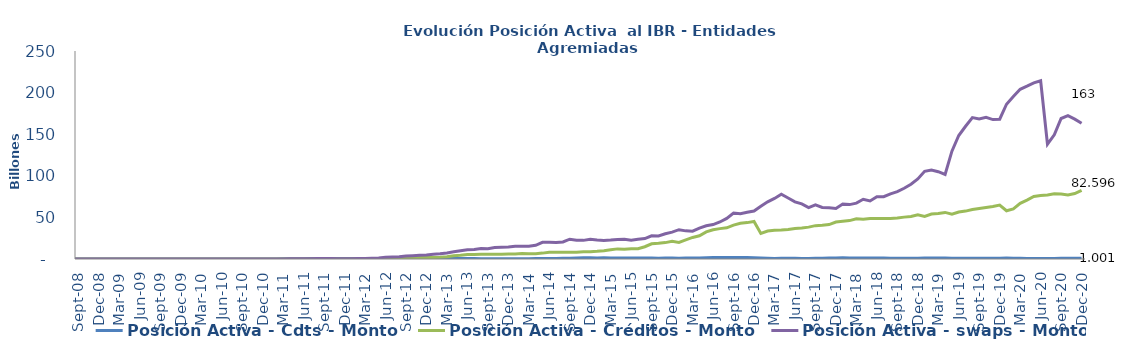
| Category | Posición Activa - Cdts - Monto | Posición Activa - Créditos - Monto | Posición Activa - swaps - Monto |
|---|---|---|---|
| 2008-07-01 | 0 | 0 | 0 |
| 2008-08-01 | 0 | 0 | 0 |
| 2008-09-01 | 0 | 0 | 0 |
| 2008-10-01 | 0 | 0 | 0 |
| 2008-11-01 | 0 | 0 | 0 |
| 2008-12-01 | 0 | 0 | 0 |
| 2009-01-01 | 0 | 0 | 0 |
| 2009-02-01 | 7428500000 | 0 | 0 |
| 2009-03-01 | 7428500000 | 0 | 0 |
| 2009-04-01 | 7428500000 | 0 | 0 |
| 2009-05-01 | 7428500000 | 0 | 0 |
| 2009-06-01 | 7428500000 | 0 | 0 |
| 2009-07-01 | 7428500000 | 0 | 0 |
| 2009-08-01 | 7428500000 | 0 | 0 |
| 2009-09-01 | 7428500000 | 0 | 0 |
| 2009-10-01 | 7928500000 | 0 | 0 |
| 2009-11-01 | 22928500000 | 0 | 0 |
| 2009-12-01 | 22928500000 | 0 | 0 |
| 2010-01-01 | 22928500000 | 0 | 400000000 |
| 2010-02-01 | 22928500000 | 0 | 400000000 |
| 2010-03-01 | 22928500000 | 0 | 1300000000 |
| 2010-04-01 | 22928500000 | 0 | 9300000000 |
| 2010-05-01 | 22928500000 | 0 | 24000000000 |
| 2010-06-01 | 22928500000 | 0 | 35000000000 |
| 2010-07-01 | 22928500000 | 0 | 49000000000 |
| 2010-08-01 | 15500000000 | 0 | 51000000000 |
| 2010-09-01 | 15500000000 | 0 | 42000000000 |
| 2010-10-01 | 62500000000 | 0 | 41000000000 |
| 2010-11-01 | 79500000000 | 0 | 29000000000 |
| 2010-12-01 | 81500000000 | 0 | 22000000000 |
| 2011-01-01 | 86000000000 | 0 | 23500000000 |
| 2011-02-01 | 134000000000 | 0 | 79500000000 |
| 2011-03-01 | 251400000000 | 0 | 114500000000 |
| 2011-04-01 | 282400000000 | 0 | 212500000000 |
| 2011-05-01 | 311900000000 | 0 | 246500000000 |
| 2011-06-01 | 450924000000 | 0 | 280500000000 |
| 2011-07-01 | 628924000000 | 0 | 307500000000 |
| 2011-08-01 | 650424000000 | 0 | 496500000000 |
| 2011-09-01 | 590324000000 | 0 | 493500000000 |
| 2011-10-01 | 571324000000 | 0 | 503000000000 |
| 2011-11-01 | 564354000000 | 0 | 357000000000 |
| 2011-12-01 | 573354000000 | 0 | 348000000000 |
| 2012-01-01 | 578854000000 | 0 | 368000000000 |
| 2012-02-01 | 569324000000 | 0 | 469000000000 |
| 2012-03-01 | 394324000000 | 0 | 708000000000 |
| 2012-04-01 | 362824000000 | 0 | 1052500000000 |
| 2012-05-01 | 425324000000 | 0 | 1321850000000 |
| 2012-06-01 | 472528000000 | 0 | 2131450000000 |
| 2012-07-01 | 467028000000 | 10736400932.6 | 2430450000000 |
| 2012-08-01 | 467028000000 | 395898409383.73 | 2831550000000 |
| 2012-09-01 | 514128000000 | 1278623915608.46 | 3465550000000 |
| 2012-10-01 | 528328000000 | 1409219995143.76 | 3916900000000 |
| 2012-11-01 | 503328000000 | 1739292606539.45 | 4543100000000 |
| 2012-12-01 | 538118000000 | 1753702085065.83 | 4921600000000 |
| 2013-01-01 | 612118000000 | 1860190799905.28 | 5800050000000 |
| 2013-02-01 | 567619540000 | 2113733072125.38 | 6318174692981 |
| 2013-03-01 | 626411310533 | 2638808537970.97 | 7322374692981 |
| 2013-04-01 | 629111310533 | 3794306574436.62 | 8687553692981 |
| 2013-05-01 | 639011310533 | 4443519152060.31 | 9853614804093 |
| 2013-06-01 | 579211310533 | 5441636414484 | 11004589051114 |
| 2013-07-01 | 619911310533 | 5276885903223 | 11472101064827 |
| 2013-08-01 | 264748310533 | 5793112373612 | 12500291064827 |
| 2013-09-01 | 235198310533 | 5781182186427 | 12379491064827 |
| 2013-10-01 | 287324065335 | 5721227676911.381 | 13896537064827 |
| 2013-11-01 | 330716307053.16 | 5769151414412.79 | 14219298533045 |
| 2013-12-01 | 351289281441 | 6033441138708.75 | 14497299602830 |
| 2014-01-01 | 415560557858 | 5904465606780.36 | 15189393602830 |
| 2014-02-01 | 421812163336 | 6592170750743.01 | 15247970102830 |
| 2014-03-01 | 398635445434 | 6454762439295.27 | 15371390390463 |
| 2014-04-01 | 505726541829 | 6413323429971.03 | 16452051310463 |
| 2014-05-01 | 522799425000 | 7069454807140.37 | 19992594629221.91 |
| 2014-06-01 | 617169430000 | 8104068718395.04 | 20048124203761.16 |
| 2014-07-01 | 680622729450 | 8165185122690.54 | 19722335424382.492 |
| 2014-08-01 | 756139827000 | 8078177412953.88 | 20517588213883 |
| 2014-09-01 | 938513426809.328 | 8003623952520.778 | 23817248811402.992 |
| 2014-10-01 | 1085627969999.998 | 8010472710623.305 | 22656264562178.992 |
| 2014-11-01 | 1356560691367.905 | 8724921587924.001 | 22396570950523 |
| 2014-12-01 | 1367078350000 | 8797305493724.32 | 23642742101498 |
| 2015-01-01 | 1293754500000 | 9263385595110.854 | 22764940027082.715 |
| 2015-02-01 | 1390322000000 | 10008403554124.396 | 22210507490027 |
| 2015-03-01 | 1291122000000 | 11056737501660.055 | 22789161192534.68 |
| 2015-04-01 | 1155322000000 | 12157445776599.592 | 23567227758727.7 |
| 2015-05-01 | 1089813000000 | 11714375535106.436 | 23774907278634.305 |
| 2015-06-01 | 1141513000000 | 12407392413540.484 | 22696018508157.156 |
| 2015-07-01 | 1269327666147 | 12421253163765.184 | 23667535655155.49 |
| 2015-08-01 | 1149827666147 | 14732094647912.19 | 24499865405155.484 |
| 2015-09-01 | 1094927666147 | 18275955310324.863 | 27906116302241.14 |
| 2015-10-01 | 986527666147 | 18878869867150.16 | 27759640112993.98 |
| 2015-11-01 | 1087027666147 | 19694520524655.047 | 30367137758015.98 |
| 2015-12-01 | 1081027666147 | 21192540679005.13 | 32342306254816.98 |
| 2016-01-01 | 1038064375438.43 | 19977514817492.54 | 35212979556095.375 |
| 2016-02-01 | 1068049372938.43 | 22902299660100.133 | 33822025975882.445 |
| 2016-03-01 | 1257396510438.43 | 25918368881639.652 | 33434779272390.047 |
| 2016-04-01 | 1145425000000 | 27903668641981.312 | 37046880484154.11 |
| 2016-05-01 | 1531395000000 | 32621114880164.73 | 39908396979761.27 |
| 2016-06-01 | 1705195000000 | 35183640497890.742 | 41366680595973.1 |
| 2016-07-01 | 1836308000000 | 36521841812503.32 | 44471316930976.79 |
| 2016-08-01 | 1870808000000 | 37465674066332.95 | 48816567034654.92 |
| 2016-09-01 | 1929687493130 | 40686213476757.7 | 55251579491117.45 |
| 2016-10-01 | 1882682961712 | 42864686598625.914 | 54309484290905.336 |
| 2016-11-01 | 1878248867176 | 43733971005961.09 | 56118948154012.44 |
| 2016-12-01 | 1468748425000 | 45151117036611.55 | 57699253311873.81 |
| 2017-01-01 | 1143108000000 | 30719580969277.98 | 63422656832652.35 |
| 2017-02-01 | 959983000000 | 33544129154349.8 | 68757567415515.25 |
| 2017-03-01 | 577051000000 | 34462812060371.684 | 72819778766690.34 |
| 2017-04-01 | 885158000000 | 34827145198479.086 | 77767325467809.62 |
| 2017-05-01 | 833037000000 | 35497786022672.44 | 73316207022947.58 |
| 2017-06-01 | 767212000000 | 36768829278716.77 | 68724115566899.586 |
| 2017-07-01 | 723063100000 | 37293790277269.41 | 66196996418075.26 |
| 2017-08-01 | 737198200000 | 38317542250005.2 | 61794201909898.49 |
| 2017-09-01 | 851825800000 | 40079477161418.875 | 64956887148155.3 |
| 2017-10-01 | 875668400000 | 40535657583816.695 | 61960974775715.3 |
| 2017-11-01 | 1217681607735 | 41397643384740.86 | 61523240467384.72 |
| 2017-12-01 | 1195773462000 | 44372983729678.305 | 60736713351879.72 |
| 2018-01-01 | 1486153000000 | 45316260145228 | 66047253084281.72 |
| 2018-02-01 | 1328803000000 | 46162206571708.07 | 65387773354256.72 |
| 2018-03-01 | 1305953000000 | 48453443068790.65 | 67190421317837.914 |
| 2018-04-01 | 1282453000000 | 47890324452343.98 | 71760271521781.73 |
| 2018-05-01 | 1171161000000 | 48725588703126.695 | 69749268129720.266 |
| 2018-06-01 | 1178361000000 | 48565406337446.484 | 74906865920231.27 |
| 2018-07-01 | 1147911000000 | 48583592953609.9 | 74953597215347.72 |
| 2018-08-01 | 974361000000 | 48739509325405.945 | 78336828076056.03 |
| 2018-09-01 | 880511000000 | 49155342171520.125 | 80926405096788.67 |
| 2018-10-01 | 906123269800 | 50329644979668.08 | 85000285327947.73 |
| 2018-11-01 | 935178269800 | 51067718130478.16 | 89917602044952.98 |
| 2018-12-01 | 983678269800 | 53154821210309.25 | 96170753499983.2 |
| 2019-01-01 | 1280276927898.07 | 51241611103004.125 | 105342711964485.36 |
| 2019-02-01 | 1317202390483.93 | 54060435828151.195 | 106871828205756.19 |
| 2019-03-01 | 1263773151583.71 | 54692666315083.05 | 104945975072707.31 |
| 2019-04-01 | 1246768411398 | 55991641247250.68 | 101579729933697.45 |
| 2019-05-01 | 1012341181800 | 53805320644815.23 | 129568137269667.69 |
| 2019-06-01 | 999138572800 | 56508944560043.25 | 148452268415643.94 |
| 2019-07-01 | 952207980300 | 57562475653317.766 | 159554889555444.84 |
| 2019-08-01 | 990963550348 | 59413925521552.75 | 170008456352171.3 |
| 2019-09-01 | 916745301648 | 60644336673555.46 | 168191675391740.5 |
| 2019-10-01 | 893433031848 | 61908575234728.445 | 170225602844305.4 |
| 2019-11-01 | 965433031848 | 63113224205513.6 | 167546382534157.9 |
| 2019-12-01 | 1006133031848 | 64853593354215.56 | 167987758390619.75 |
| 2020-01-01 | 1079446125000 | 58010103353918.32 | 186004869196381.56 |
| 2020-02-01 | 829796125000 | 60141255951775.9 | 195340422376457.97 |
| 2020-03-01 | 862796125000 | 66942515598767.55 | 203921731417590.47 |
| 2020-04-01 | 653796125000 | 70845901183793.5 | 207698598041562.5 |
| 2020-05-01 | 717881961000 | 75206334203590.08 | 211703508027395.56 |
| 2020-06-01 | 551381961000 | 76355488197984.17 | 214232790563987.9 |
| 2020-07-01 | 732005126000 | 77057330577169.33 | 137935629036431.1 |
| 2020-08-01 | 705505126000 | 78406166028958.83 | 149273833733936.2 |
| 2020-09-01 | 1010148909000 | 78142918579817.9 | 168848725800814.16 |
| 2020-10-01 | 967817581000 | 76999647869466.42 | 172288340571313.84 |
| 2020-11-01 | 1001498553000 | 78618040183756.48 | 168128513598030.06 |
| 2020-12-01 | 1001032058000 | 82596043059265.86 | 163231890936989.25 |